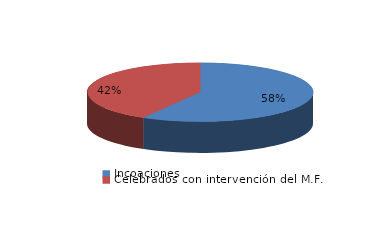
| Category | Series 0 |
|---|---|
| Incoaciones | 793 |
| Celebrados con intervención del M.F. | 567 |